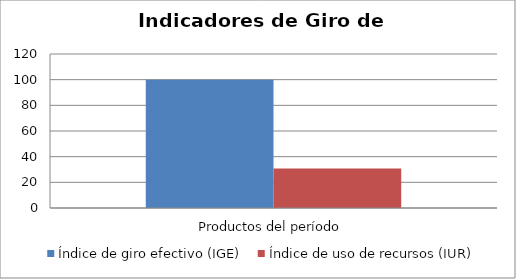
| Category | Índice de giro efectivo (IGE) | Índice de uso de recursos (IUR)  |
|---|---|---|
| Productos del período | 99.964 | 30.767 |